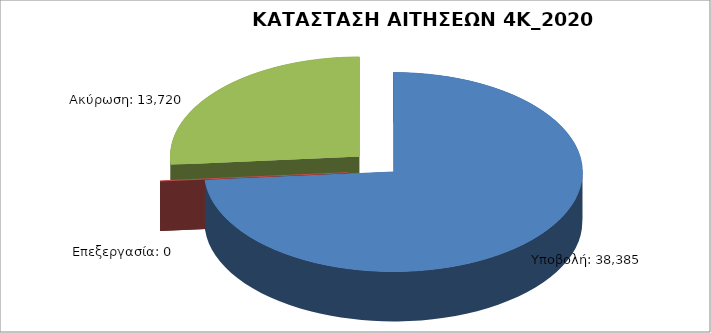
| Category | Series 0 |
|---|---|
| Υποβολή: | 38385 |
| Επεξεργασία: | 0 |
| Ακύρωση: | 13720 |